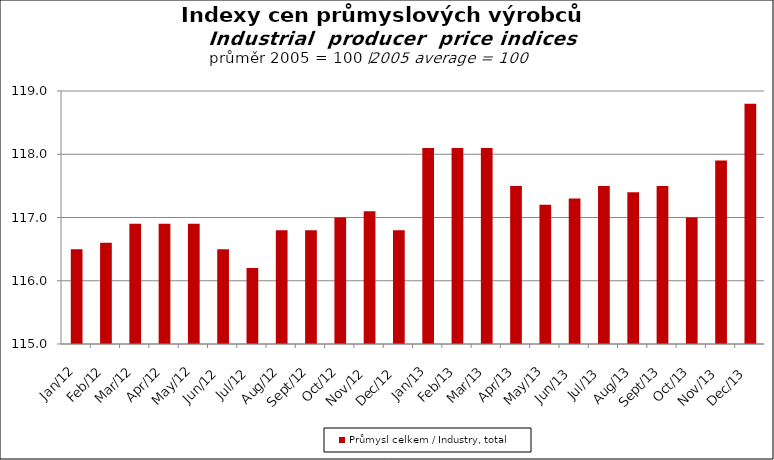
| Category | Průmysl celkem / Industry, total |
|---|---|
| 2012-01-01 | 116.5 |
| 2012-02-01 | 116.6 |
| 2012-03-01 | 116.9 |
| 2012-04-01 | 116.9 |
| 2012-05-01 | 116.9 |
| 2012-06-01 | 116.5 |
| 2012-07-01 | 116.2 |
| 2012-08-01 | 116.8 |
| 2012-09-01 | 116.8 |
| 2012-10-01 | 117 |
| 2012-11-01 | 117.1 |
| 2012-12-01 | 116.8 |
| 2013-01-01 | 118.1 |
| 2013-02-01 | 118.1 |
| 2013-03-01 | 118.1 |
| 2013-04-01 | 117.5 |
| 2013-05-01 | 117.2 |
| 2013-06-01 | 117.3 |
| 2013-07-01 | 117.5 |
| 2013-08-01 | 117.4 |
| 2013-09-01 | 117.5 |
| 2013-10-01 | 117 |
| 2013-11-01 | 117.9 |
| 2013-12-01 | 118.8 |